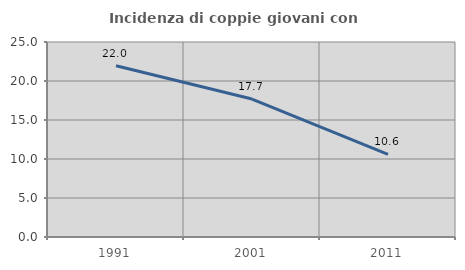
| Category | Incidenza di coppie giovani con figli |
|---|---|
| 1991.0 | 21.956 |
| 2001.0 | 17.684 |
| 2011.0 | 10.588 |